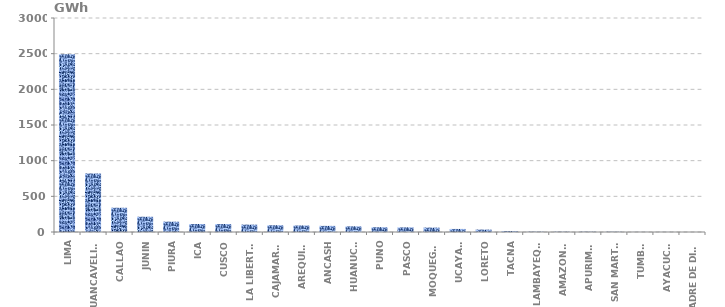
| Category | Series 0 |
|---|---|
| LIMA | 2490.414 |
| HUANCAVELICA | 818.647 |
| CALLAO | 339.851 |
| JUNIN | 213.766 |
| PIURA | 144.77 |
| ICA | 112.326 |
| CUSCO | 111.714 |
| LA LIBERTAD | 103.453 |
| CAJAMARCA | 94.767 |
| AREQUIPA | 91.256 |
| ANCASH | 85.728 |
| HUANUCO | 79.306 |
| PUNO | 66.936 |
| PASCO | 65.005 |
| MOQUEGUA | 61.833 |
| UCAYALI | 42.774 |
| LORETO | 33.83 |
| TACNA | 12.894 |
| LAMBAYEQUE | 4.653 |
| AMAZONAS | 4.222 |
| APURIMAC | 4.129 |
| SAN MARTÍN | 3.503 |
| TUMBES | 1.101 |
| AYACUCHO | 0.929 |
| MADRE DE DIOS | 0.132 |